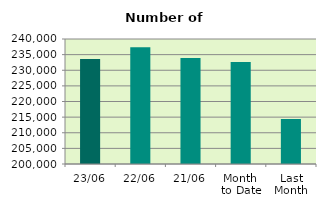
| Category | Series 0 |
|---|---|
| 23/06 | 233608 |
| 22/06 | 237344 |
| 21/06 | 233958 |
| Month 
to Date | 232673.882 |
| Last
Month | 214383.182 |